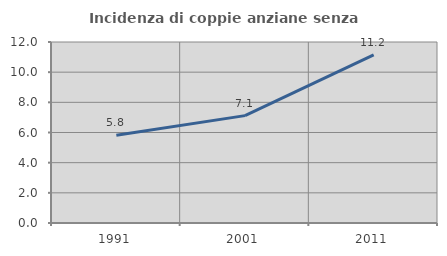
| Category | Incidenza di coppie anziane senza figli  |
|---|---|
| 1991.0 | 5.811 |
| 2001.0 | 7.119 |
| 2011.0 | 11.151 |